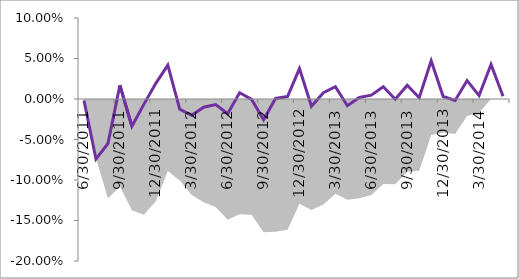
| Category | Series 1 |
|---|---|
| 0 | -0.002 |
| 01/01/1900 | -0.074 |
| 02/01/1900 | -0.055 |
| 03/01/1900 | 0.017 |
| 04/01/1900 | -0.034 |
| 05/01/1900 | -0.007 |
| 06/01/1900 | 0.019 |
| 07/01/1900 | 0.042 |
| 08/01/1900 | -0.013 |
| 09/01/1900 | -0.02 |
| 10/01/1900 | -0.01 |
| 11/01/1900 | -0.007 |
| 12/01/1900 | -0.018 |
| 13/01/1900 | 0.008 |
| 14/01/1900 | -0.001 |
| 15/01/1900 | -0.026 |
| 16/01/1900 | 0.001 |
| 17/01/1900 | 0.003 |
| 18/01/1900 | 0.038 |
| 19/01/1900 | -0.009 |
| 20/01/1900 | 0.008 |
| 21/01/1900 | 0.015 |
| 22/01/1900 | -0.008 |
| 23/01/1900 | 0.002 |
| 24/01/1900 | 0.005 |
| 25/01/1900 | 0.015 |
| 26/01/1900 | 0 |
| 27/01/1900 | 0.017 |
| 28/01/1900 | 0.002 |
| 29/01/1900 | 0.047 |
| 30/01/1900 | 0.003 |
| 31/01/1900 | -0.002 |
| 01/02/1900 | 0.023 |
| 02/02/1900 | 0.004 |
| 03/02/1900 | 0.043 |
| 04/02/1900 | 0.003 |